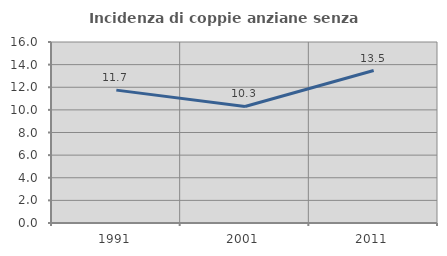
| Category | Incidenza di coppie anziane senza figli  |
|---|---|
| 1991.0 | 11.746 |
| 2001.0 | 10.303 |
| 2011.0 | 13.48 |